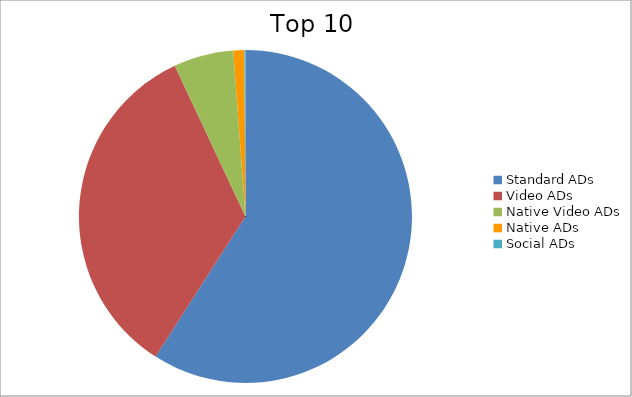
| Category | Series 0 |
|---|---|
| Standard ADs | 59.08 |
| Video ADs | 33.93 |
| Native Video ADs | 5.81 |
| Native ADs | 1.06 |
| Social ADs | 0.11 |